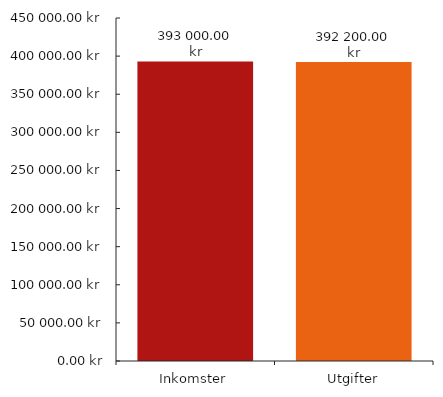
| Category | Diagramdata |
|---|---|
| 0 | 393000 |
| 1 | 392200 |